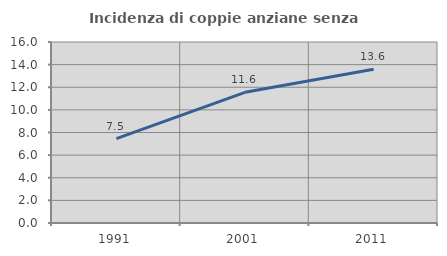
| Category | Incidenza di coppie anziane senza figli  |
|---|---|
| 1991.0 | 7.456 |
| 2001.0 | 11.553 |
| 2011.0 | 13.6 |